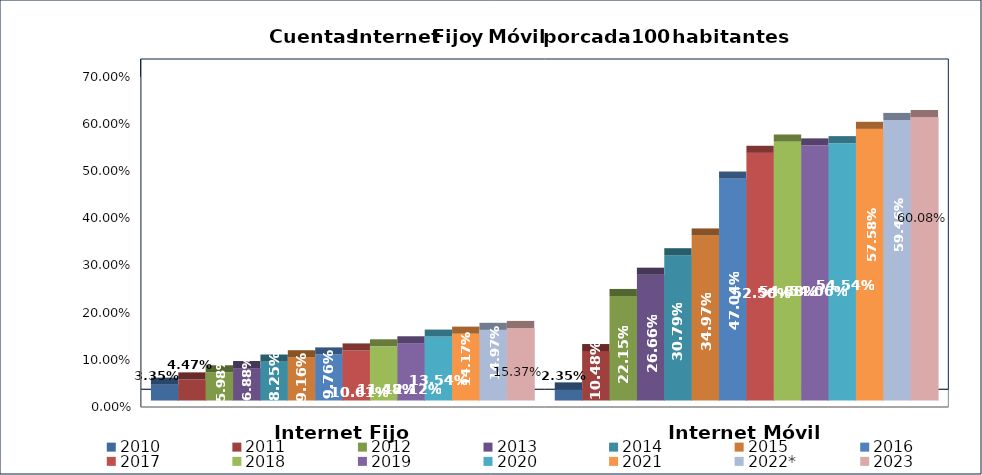
| Category | 2010 | 2011 | 2012 | 2013 | 2014 | 2015 | 2016 | 2017 | 2018 | 2019 | 2020 | 2021 | 2022* | 2023 |
|---|---|---|---|---|---|---|---|---|---|---|---|---|---|---|
| Internet Fijo | 0.033 | 0.045 | 0.06 | 0.069 | 0.083 | 0.092 | 0.098 | 0.106 | 0.115 | 0.121 | 0.135 | 0.142 | 0.15 | 0.154 |
| Internet Móvil | 0.024 | 0.105 | 0.222 | 0.267 | 0.308 | 0.35 | 0.47 | 0.525 | 0.549 | 0.541 | 0.545 | 0.576 | 0.595 | 0.601 |